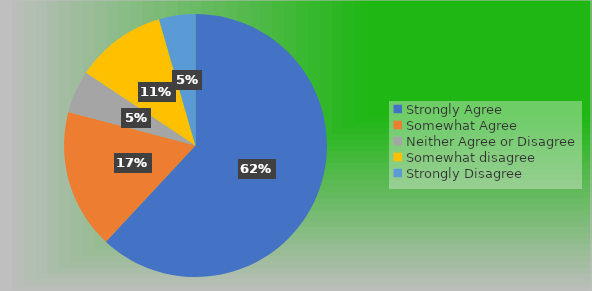
| Category | Series 0 |
|---|---|
| Strongly Agree | 83 |
| Somewhat Agree | 23 |
| Neither Agree or Disagree | 7 |
| Somewhat disagree | 15 |
| Strongly Disagree | 6 |